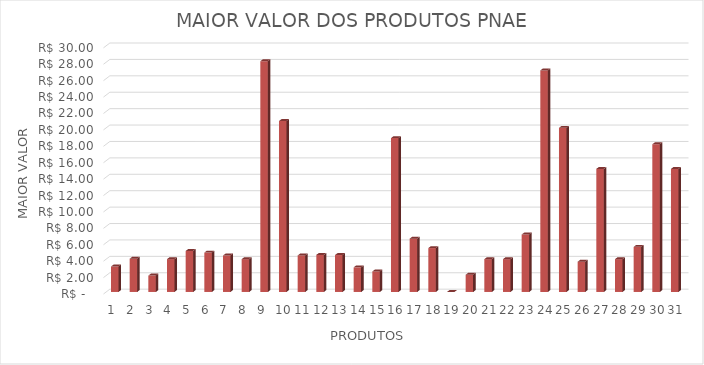
| Category | Series 0 |
|---|---|
| 0 | 3.1 |
| 1 | 4.05 |
| 2 | 2 |
| 3 | 4 |
| 4 | 5 |
| 5 | 4.8 |
| 6 | 4.44 |
| 7 | 4 |
| 8 | 28.12 |
| 9 | 20.83 |
| 10 | 4.45 |
| 11 | 4.52 |
| 12 | 4.5 |
| 13 | 3 |
| 14 | 2.5 |
| 15 | 18.75 |
| 16 | 6.5 |
| 17 | 5.35 |
| 18 | 0 |
| 19 | 2.1 |
| 20 | 4 |
| 21 | 4 |
| 22 | 7 |
| 23 | 27 |
| 24 | 20 |
| 25 | 3.69 |
| 26 | 15 |
| 27 | 4 |
| 28 | 5.5 |
| 29 | 18 |
| 30 | 15 |